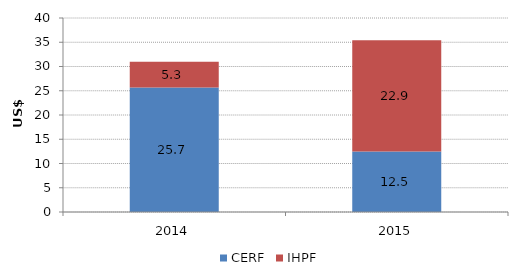
| Category | CERF | IHPF |
|---|---|---|
| 2014.0 | 25.675 | 5.29 |
| 2015.0 | 12.479 | 22.915 |